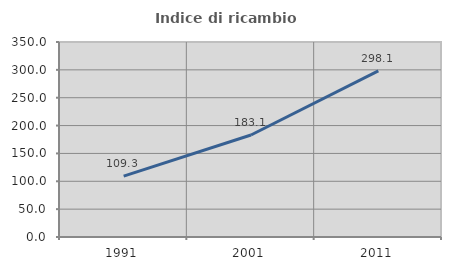
| Category | Indice di ricambio occupazionale  |
|---|---|
| 1991.0 | 109.333 |
| 2001.0 | 183.117 |
| 2011.0 | 298.148 |